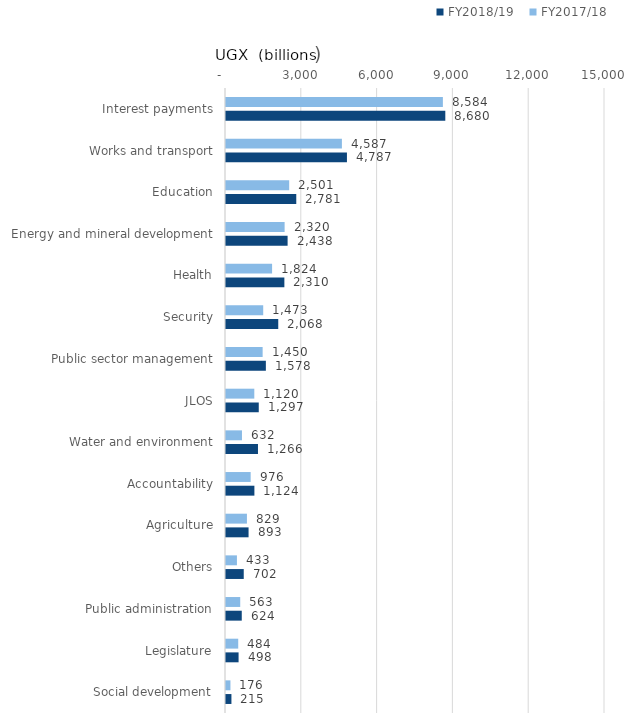
| Category | FY2018/19 | FY2017/18 |
|---|---|---|
| Social development | 214.711 | 175.81 |
| Legislature | 497.801 | 483.755 |
| Public administration | 623.624 | 562.968 |
| Others | 702.245 | 432.711 |
| Agriculture | 892.92 | 828.515 |
| Accountability | 1123.736 | 976.234 |
| Water and environment | 1265.808 | 632.033 |
| JLOS | 1296.558 | 1120.1 |
| Public sector management | 1577.726 | 1450.049 |
| Security | 2067.981 | 1472.765 |
| Health | 2310.068 | 1824.082 |
| Energy and mineral development | 2438.199 | 2319.802 |
| Education | 2781.127 | 2501.123 |
| Works and transport | 4786.619 | 4587.275 |
| Interest payments | 8679.655 | 8583.677 |